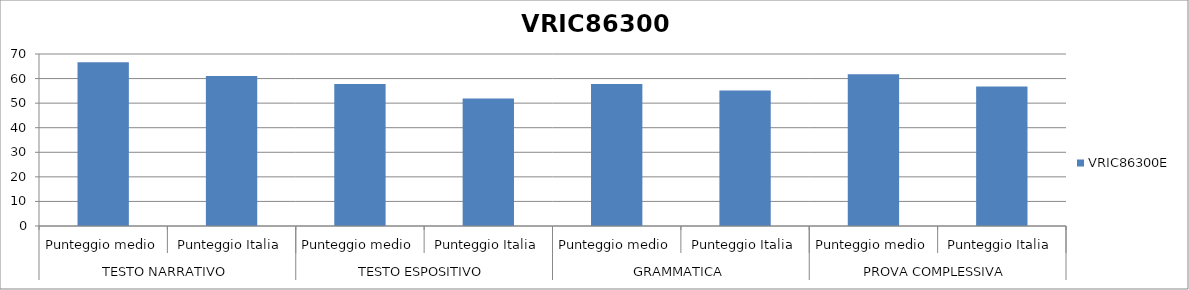
| Category | VRIC86300E |
|---|---|
| 0 | 66.6 |
| 1 | 61 |
| 2 | 57.8 |
| 3 | 51.9 |
| 4 | 57.8 |
| 5 | 55.1 |
| 6 | 61.8 |
| 7 | 56.8 |